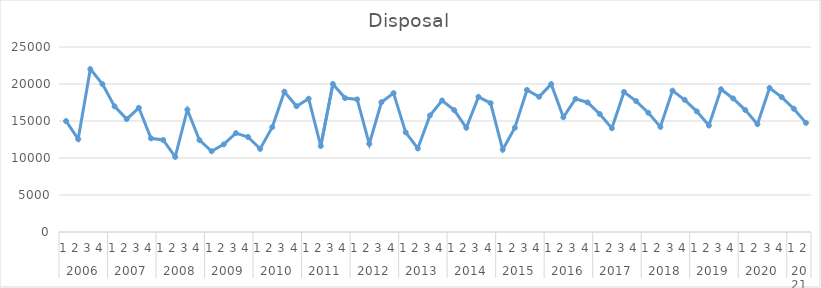
| Category | Disposal |
|---|---|
| 0 | 14989 |
| 1 | 12550 |
| 2 | 22009 |
| 3 | 19980 |
| 4 | 16976 |
| 5 | 15265 |
| 6 | 16781 |
| 7 | 12655 |
| 8 | 12435 |
| 9 | 10153 |
| 10 | 16525 |
| 11 | 12406 |
| 12 | 10913 |
| 13 | 11842 |
| 14 | 13359 |
| 15 | 12844 |
| 16 | 11228 |
| 17 | 14168 |
| 18 | 18960 |
| 19 | 16997 |
| 20 | 18014 |
| 21 | 11617 |
| 22 | 19996 |
| 23 | 18095 |
| 24 | 17921 |
| 25 | 11910 |
| 26 | 17538 |
| 27 | 18762 |
| 28 | 13464 |
| 29 | 11296 |
| 30 | 15746 |
| 31 | 17772 |
| 32 | 16468 |
| 33 | 14087 |
| 34 | 18264 |
| 35 | 17420 |
| 36 | 11128 |
| 37 | 14087 |
| 38 | 19198 |
| 39 | 18267 |
| 40 | 19983 |
| 41 | 15513 |
| 42 | 17991 |
| 43 | 17506.253 |
| 44 | 15941.495 |
| 45 | 14029.585 |
| 46 | 18927.676 |
| 47 | 17685.608 |
| 48 | 16120.85 |
| 49 | 14208.941 |
| 50 | 19107.032 |
| 51 | 17864.964 |
| 52 | 16300.205 |
| 53 | 14388.296 |
| 54 | 19286.387 |
| 55 | 18044.319 |
| 56 | 16479.56 |
| 57 | 14567.651 |
| 58 | 19465.742 |
| 59 | 18223.674 |
| 60 | 16658.915 |
| 61 | 14747.006 |